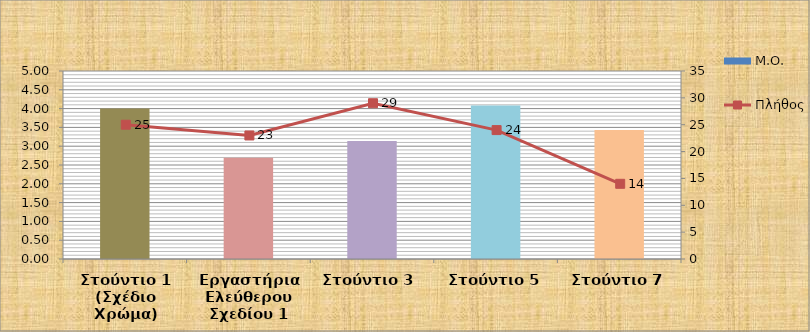
| Category | Μ.Ο. |
|---|---|
| Στούντιο 1 (Σχέδιο Χρώμα) | 4 |
| Εργαστήρια Ελεύθερου Σχεδίου 1 | 2.696 |
| Στούντιο 3  | 3.138 |
| Στούντιο 5 | 4.083 |
| Στούντιο 7 | 3.429 |